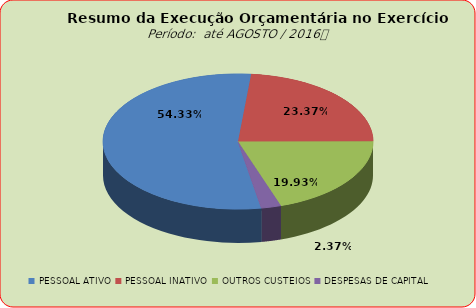
| Category | Series 0 |
|---|---|
| PESSOAL ATIVO | 89467128.6 |
| PESSOAL INATIVO | 38483874.04 |
| OUTROS CUSTEIOS | 32818229.4 |
| DESPESAS DE CAPITAL | 3894312.88 |